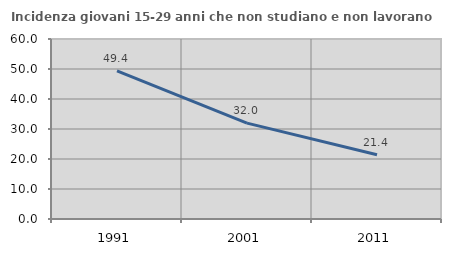
| Category | Incidenza giovani 15-29 anni che non studiano e non lavorano  |
|---|---|
| 1991.0 | 49.376 |
| 2001.0 | 31.953 |
| 2011.0 | 21.429 |